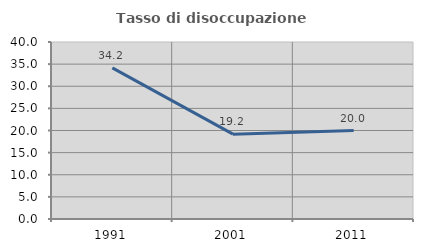
| Category | Tasso di disoccupazione giovanile  |
|---|---|
| 1991.0 | 34.167 |
| 2001.0 | 19.178 |
| 2011.0 | 20 |